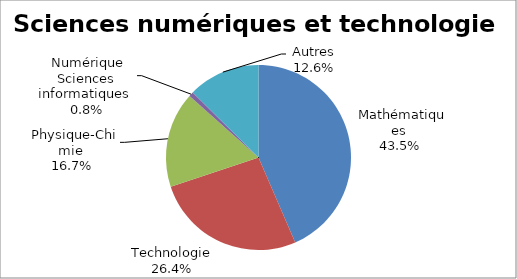
| Category | Sciences numériques et technologie |
|---|---|
| Mathématiques | 0.435 |
| Technologie | 0.264 |
| Physique-Chimie | 0.167 |
| Numérique Sciences informatiques | 0.008 |
| Autres | 0.126 |